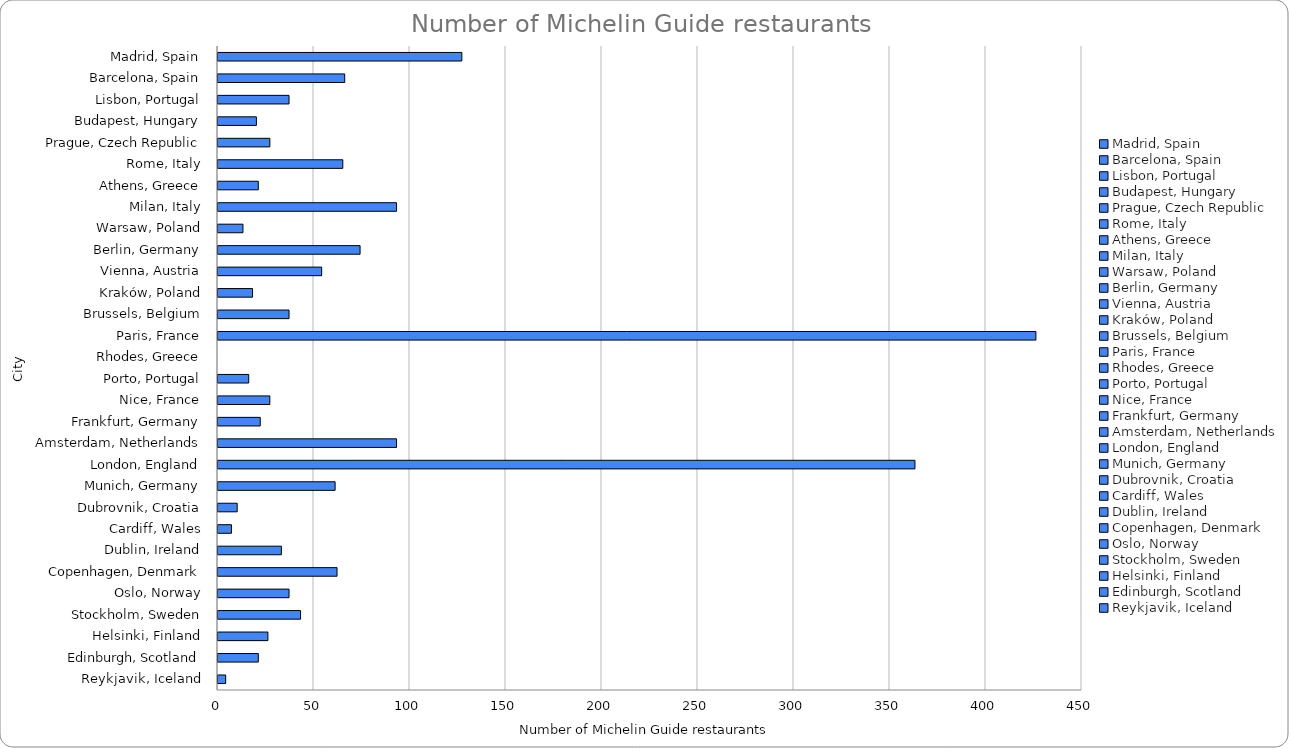
| Category | Number of Michelin Guide restaurants |
|---|---|
| Madrid, Spain | 127 |
| Barcelona, Spain | 66 |
| Lisbon, Portugal | 37 |
| Budapest, Hungary | 20 |
| Prague, Czech Republic | 27 |
| Rome, Italy | 65 |
| Athens, Greece | 21 |
| Milan, Italy | 93 |
| Warsaw, Poland | 13 |
| Berlin, Germany | 74 |
| Vienna, Austria | 54 |
| Kraków, Poland | 18 |
| Brussels, Belgium | 37 |
| Paris, France | 426 |
| Rhodes, Greece | 0 |
| Porto, Portugal | 16 |
| Nice, France | 27 |
| Frankfurt, Germany | 22 |
| Amsterdam, Netherlands | 93 |
| London, England | 363 |
| Munich, Germany | 61 |
| Dubrovnik, Croatia | 10 |
| Cardiff, Wales | 7 |
| Dublin, Ireland | 33 |
| Copenhagen, Denmark | 62 |
| Oslo, Norway | 37 |
| Stockholm, Sweden | 43 |
| Helsinki, Finland | 26 |
| Edinburgh, Scotland | 21 |
| Reykjavik, Iceland | 4 |